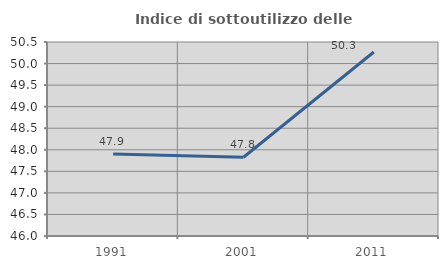
| Category | Indice di sottoutilizzo delle abitazioni  |
|---|---|
| 1991.0 | 47.904 |
| 2001.0 | 47.826 |
| 2011.0 | 50.267 |